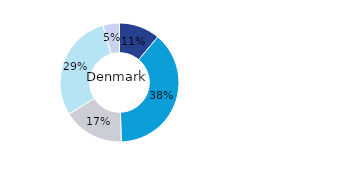
| Category | Denmark |
|---|---|
| Office | 0.111 |
| Residential | 0.384 |
| Retail | 0.166 |
| Logistics* | 0.294 |
| Other | 0.045 |